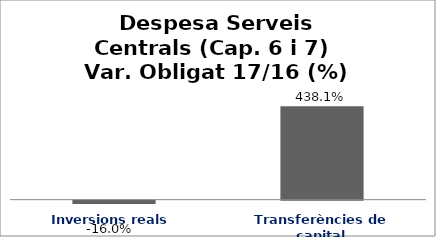
| Category | Series 0 |
|---|---|
| Inversions reals | -0.16 |
| Transferències de capital | 4.381 |